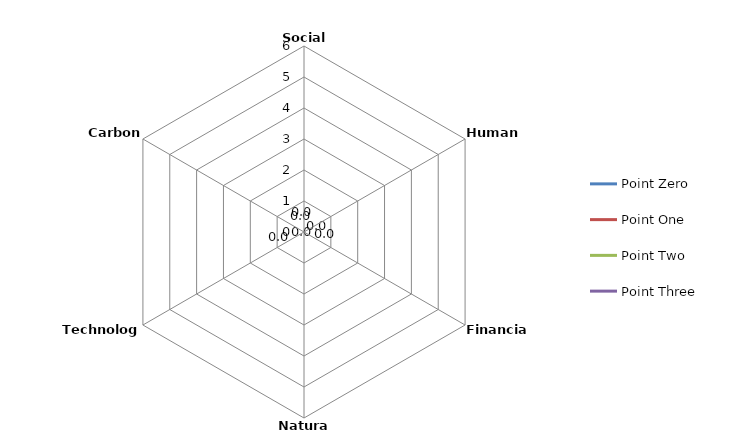
| Category | Point Zero | Point One | Point Two | Point Three |
|---|---|---|---|---|
| Social |  |  |  | 0 |
| Human |  |  |  | 0 |
| Financial |  |  |  | 0 |
| Natural |  |  |  | 0 |
| Technology |  |  |  | 0 |
| Carbon |  |  |  | 0 |